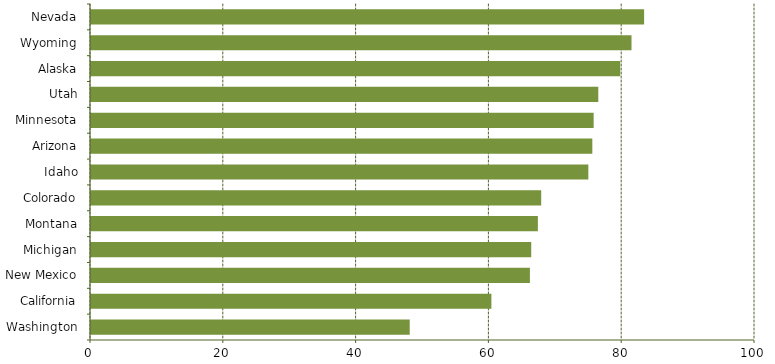
| Category | Series 0 |
|---|---|
| Washington | 48 |
| California | 60.3 |
| New Mexico | 66.1 |
| Michigan | 66.3 |
| Montana | 67.3 |
| Colorado | 67.8 |
| Idaho | 74.9 |
| Arizona | 75.5 |
| Minnesota | 75.7 |
| Utah | 76.4 |
| Alaska | 79.7 |
| Wyoming | 81.4 |
| Nevada | 83.3 |